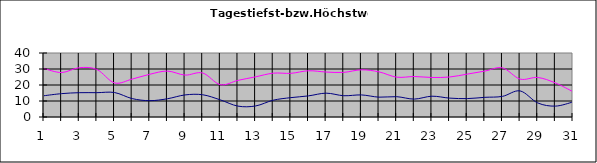
| Category | Series 0 | Series 1 |
|---|---|---|
| 0 | 13.3 | 30.3 |
| 1 | 14.6 | 27.8 |
| 2 | 15.2 | 30.8 |
| 3 | 15.2 | 29.7 |
| 4 | 15.3 | 21.3 |
| 5 | 11.5 | 23.7 |
| 6 | 10.2 | 26.7 |
| 7 | 11.4 | 28.7 |
| 8 | 13.8 | 26.2 |
| 9 | 13.9 | 27.5 |
| 10 | 10.7 | 20.2 |
| 11 | 6.8 | 22.9 |
| 12 | 6.9 | 25.1 |
| 13 | 10.5 | 27.4 |
| 14 | 12.1 | 27.3 |
| 15 | 13.2 | 28.9 |
| 16 | 14.9 | 28.1 |
| 17 | 13.3 | 27.9 |
| 18 | 13.8 | 29.5 |
| 19 | 12.4 | 28.2 |
| 20 | 12.7 | 24.9 |
| 21 | 11.2 | 25.3 |
| 22 | 13 | 24.7 |
| 23 | 11.8 | 25 |
| 24 | 11.5 | 26.8 |
| 25 | 12.3 | 28.7 |
| 26 | 12.9 | 30.7 |
| 27 | 16.3 | 23.7 |
| 28 | 8.8 | 24.7 |
| 29 | 6.8 | 21.3 |
| 30 | 9.4 | 15.8 |